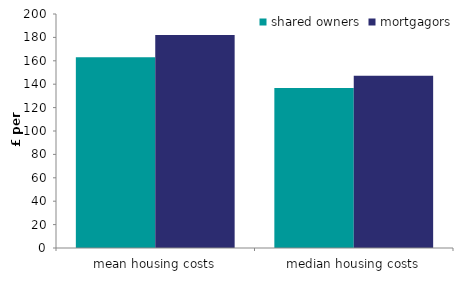
| Category | shared owners | mortgagors |
|---|---|---|
| mean housing costs | 162.941 | 182.002 |
| median housing costs | 136.762 | 147.119 |